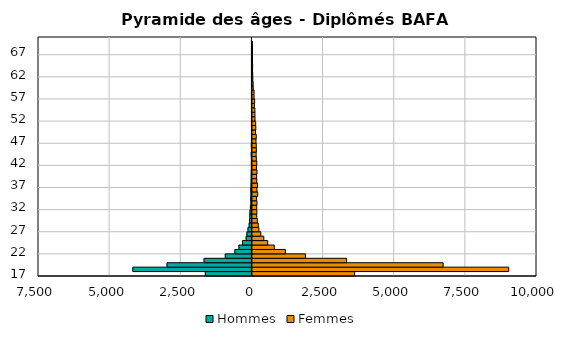
| Category | Hommes | Femmes |
|---|---|---|
| 17.0 | -1637 | 3591 |
| 18.0 | -4185 | 9007 |
| 19.0 | -2982 | 6702 |
| 20.0 | -1682 | 3309 |
| 21.0 | -936 | 1865 |
| 22.0 | -599 | 1157 |
| 23.0 | -456 | 769 |
| 24.0 | -331 | 538 |
| 25.0 | -203 | 400 |
| 26.0 | -176 | 295 |
| 27.0 | -138 | 227 |
| 28.0 | -97 | 205 |
| 29.0 | -80 | 173 |
| 30.0 | -75 | 152 |
| 31.0 | -68 | 156 |
| 32.0 | -53 | 152 |
| 33.0 | -37 | 160 |
| 34.0 | -43 | 142 |
| 35.0 | -35 | 186 |
| 36.0 | -39 | 159 |
| 37.0 | -31 | 179 |
| 38.0 | -27 | 155 |
| 39.0 | -25 | 146 |
| 40.0 | -22 | 162 |
| 41.0 | -18 | 143 |
| 42.0 | -19 | 154 |
| 43.0 | -17 | 137 |
| 44.0 | -24 | 130 |
| 45.0 | -16 | 138 |
| 46.0 | -19 | 134 |
| 47.0 | -13 | 125 |
| 48.0 | -12 | 135 |
| 49.0 | -12 | 111 |
| 50.0 | -7 | 119 |
| 51.0 | -10 | 114 |
| 52.0 | -6 | 90 |
| 53.0 | -7 | 89 |
| 54.0 | -5 | 86 |
| 55.0 | -6 | 71 |
| 56.0 | -8 | 78 |
| 57.0 | -4 | 57 |
| 58.0 | -4 | 59 |
| 59.0 | -4 | 29 |
| 60.0 | -1 | 25 |
| 61.0 | -2 | 14 |
| 62.0 | -1 | 11 |
| 63.0 | -2 | 5 |
| 64.0 | -1 | 7 |
| 65.0 | -2 | 2 |
| 66.0 | -1 | 2 |
| 67.0 | 0 | 2 |
| 68.0 | -1 | 2 |
| 69.0 | -1 | 2 |
| 70.0 | 0 | 0 |